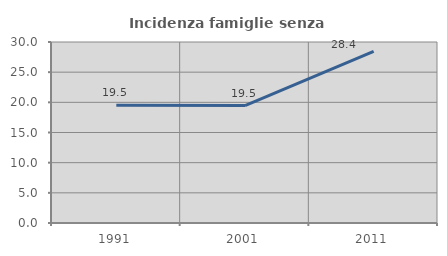
| Category | Incidenza famiglie senza nuclei |
|---|---|
| 1991.0 | 19.517 |
| 2001.0 | 19.472 |
| 2011.0 | 28.435 |